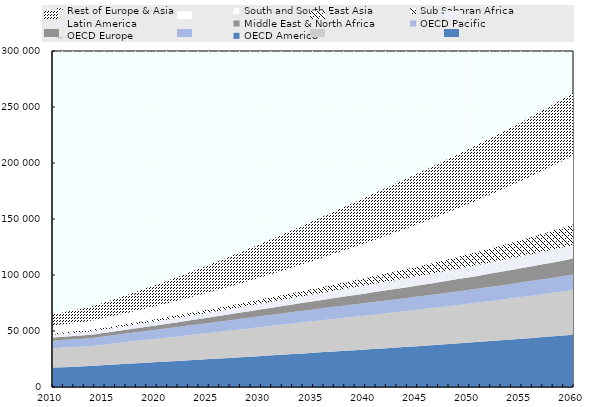
| Category | OECD America | OECD Europe | OECD Pacific | Middle East & North Africa | Latin America | Sub Saharan Africa | South and South-East Asia | Rest of Europe & Asia |
|---|---|---|---|---|---|---|---|---|
| 2010 | 17358.409 | 17320.396 | 6668.073 | 2755.995 | 2602.53 | 1284.049 | 6670.384 | 10141.153 |
| 2011 | 17682.465 | 17626.391 | 6704.527 | 2838.948 | 2701.723 | 1339.132 | 7027.896 | 10838.83 |
| 2012 | 18103.603 | 17628.13 | 6851.6 | 2935.208 | 2768.803 | 1395.791 | 7317.96 | 11512.421 |
| 2013 | 18466.684 | 17642.649 | 6984.358 | 3021.333 | 2847.126 | 1460.999 | 7660.301 | 12217.98 |
| 2014 | 18997.873 | 17908.755 | 7138.068 | 3146.246 | 2945.523 | 1543.271 | 8081.305 | 13067.204 |
| 2015 | 19573.905 | 18387.925 | 7294.242 | 3238.177 | 3052.976 | 1638.971 | 8570.223 | 13993.317 |
| 2016 | 20143.934 | 18896.903 | 7452.453 | 3333.745 | 3167.15 | 1741.76 | 9093.892 | 14960.199 |
| 2017 | 20693.503 | 19399.878 | 7611.709 | 3449.071 | 3284.867 | 1847.548 | 9653.995 | 15957.303 |
| 2018 | 21227.869 | 19894.746 | 7771.808 | 3585.081 | 3405.985 | 1960.7 | 10250.164 | 16983.533 |
| 2019 | 21753.533 | 20387.191 | 7933.506 | 3735.782 | 3526.742 | 2082.245 | 10845.727 | 18024.694 |
| 2020 | 22275.357 | 20881.053 | 8097.363 | 3902.565 | 3653.648 | 2212.191 | 11476.357 | 19087.794 |
| 2021 | 22795.931 | 21379.272 | 8263.088 | 4084.038 | 3783.403 | 2347.727 | 12137.348 | 20170.471 |
| 2022 | 23317.123 | 21881.086 | 8430.117 | 4279.217 | 3918.474 | 2492.022 | 12833.632 | 21263.597 |
| 2023 | 23840.575 | 22385.766 | 8598.173 | 4478.741 | 4058.9 | 2644.823 | 13562.114 | 22364.139 |
| 2024 | 24367.814 | 22892.446 | 8767.013 | 4682.511 | 4205.031 | 2806.14 | 14322.715 | 23467.871 |
| 2025 | 24900.309 | 23399.917 | 8936.334 | 4889.699 | 4357.293 | 2975.861 | 15114.726 | 24572.662 |
| 2026 | 25439.671 | 23899.425 | 9105.95 | 5102.102 | 4515.145 | 3154.717 | 15941.915 | 25676.248 |
| 2027 | 25987.393 | 24396.022 | 9275.454 | 5323.167 | 4678.56 | 3342.725 | 16803.279 | 26780.406 |
| 2028 | 26544.556 | 24889.601 | 9444.009 | 5550.635 | 4847.577 | 3540.479 | 17695.983 | 27884.098 |
| 2029 | 27111.329 | 25380.13 | 9610.443 | 5786.162 | 5021.988 | 3748.349 | 18621.398 | 28986.441 |
| 2030 | 27686.51 | 25867.416 | 9773.63 | 6025.464 | 5201.169 | 3966.9 | 19579.786 | 30088.759 |
| 2031 | 28264.347 | 26335.592 | 9932.839 | 6266.724 | 5382.668 | 4195.603 | 20567.607 | 31192.062 |
| 2032 | 28843.386 | 26800.618 | 10087.688 | 6512.701 | 5568.196 | 4435.986 | 21587.869 | 32299.966 |
| 2033 | 29423.153 | 27262.817 | 10237.832 | 6762.432 | 5757.622 | 4688.454 | 22639.983 | 33412.663 |
| 2034 | 30003.095 | 27722.616 | 10383.186 | 7015.661 | 5950.589 | 4953.415 | 23723.231 | 34529.106 |
| 2035 | 30582.887 | 28180.641 | 10523.783 | 7270.361 | 6146.691 | 5231.308 | 24837.312 | 35646.147 |
| 2036 | 31162.712 | 28614.765 | 10659.723 | 7526.376 | 6345.062 | 5521.711 | 25981.545 | 36758.272 |
| 2037 | 31743.029 | 29048.753 | 10791.144 | 7785.758 | 6545.799 | 5825.476 | 27155.433 | 37860.694 |
| 2038 | 32324.112 | 29483.287 | 10918.269 | 8046.819 | 6749.422 | 6143.772 | 28357.845 | 38946.653 |
| 2039 | 32906.146 | 29918.256 | 11041.423 | 8309.635 | 6955.923 | 6477.345 | 29587.154 | 40009.657 |
| 2040 | 33489.415 | 30353.925 | 11161.045 | 8575.399 | 7165.387 | 6826.977 | 30842.201 | 41042.686 |
| 2041 | 34075.482 | 30766.938 | 11278.025 | 8839.011 | 7378.555 | 7193.733 | 32123.331 | 42037.68 |
| 2042 | 34666.755 | 31184.643 | 11393.546 | 9104.278 | 7595.335 | 7578.389 | 33429.957 | 42986.882 |
| 2043 | 35265.109 | 31609.026 | 11508.65 | 9369.859 | 7815.991 | 7982.059 | 34761.925 | 43888.54 |
| 2044 | 35871.801 | 32041.483 | 11624.233 | 9636.047 | 8040.719 | 8405.791 | 36119.556 | 44743.067 |
| 2045 | 36487.562 | 32482.951 | 11741.054 | 9903.085 | 8269.624 | 8851.045 | 37502.699 | 45552.664 |
| 2046 | 37112.968 | 32914.915 | 11859.871 | 10173.99 | 8503.568 | 9317.702 | 38914.244 | 46321.125 |
| 2047 | 37748.195 | 33357.036 | 11981.279 | 10446.019 | 8741.732 | 9808.609 | 40352.003 | 47053.867 |
| 2048 | 38393.088 | 33809.705 | 12105.784 | 10719.843 | 8983.979 | 10324.53 | 41814.941 | 47757.206 |
| 2049 | 39047.23 | 34273.16 | 12233.761 | 10996.402 | 9230.047 | 10865.938 | 43304.75 | 48439.869 |
| 2050 | 39710.048 | 34747.288 | 12365.471 | 11276.554 | 9479.507 | 11434.619 | 44821.602 | 49109.943 |
| 2051 | 40380.675 | 35219.403 | 12501.142 | 11558.179 | 9730.783 | 12028.232 | 46361.456 | 49776.036 |
| 2052 | 41058.463 | 35701.882 | 12641.012 | 11843.696 | 9984.009 | 12650.563 | 47927.343 | 50444.172 |
| 2053 | 41742.896 | 36194.474 | 12785.169 | 12133.212 | 10238.813 | 13303.435 | 49517.994 | 51119.288 |
| 2054 | 42433.865 | 36697.219 | 12933.559 | 12427.502 | 10494.76 | 13987.613 | 51132.224 | 51804.714 |
| 2055 | 43131.306 | 37210.159 | 13086.056 | 12726.858 | 10751.345 | 14705.02 | 52768.038 | 52502.217 |
| 2056 | 43835.239 | 37727.297 | 13242.677 | 13025.517 | 11007.09 | 15450.815 | 54419.499 | 53210.756 |
| 2057 | 44545.752 | 38256.349 | 13403.443 | 13329.116 | 11262.647 | 16231.496 | 56089.272 | 53929.068 |
| 2058 | 45263.307 | 38798.669 | 13568.354 | 13637.512 | 11517.974 | 17047.378 | 57776.533 | 54653.768 |
| 2059 | 45988.428 | 39355.286 | 13737.257 | 13950.425 | 11773.166 | 17900.603 | 59480.186 | 55381.454 |
| 2060 | 46721.809 | 39927.519 | 13910.179 | 14267.503 | 12028.596 | 18791.302 | 61211.26 | 56108.176 |